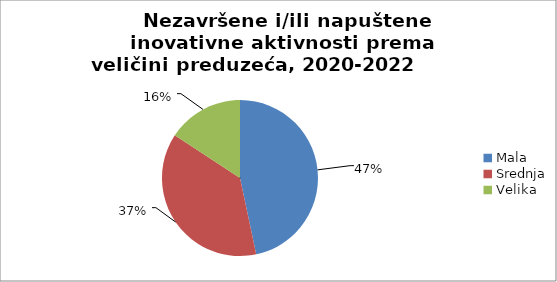
| Category |  Nezavršene i/ili napuštene inovativne aktivnosti prema veličini preduzeća, 2020-2022                                              |
|---|---|
| Mala  | 77 |
| Srednja | 62 |
| Velika | 26 |